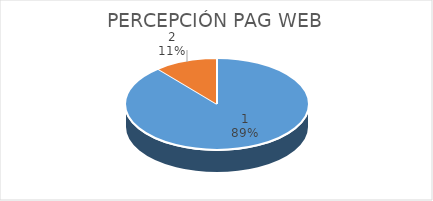
| Category | Series 0 | Series 1 |
|---|---|---|
| 0 | 6 | 2 |
| 1 | 0.75 | 0.25 |